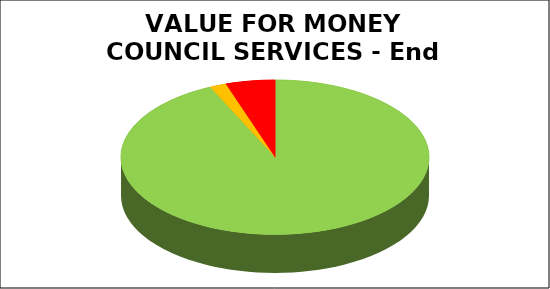
| Category | Series 0 |
|---|---|
| Green | 0.931 |
| Amber | 0.017 |
| Red | 0.052 |